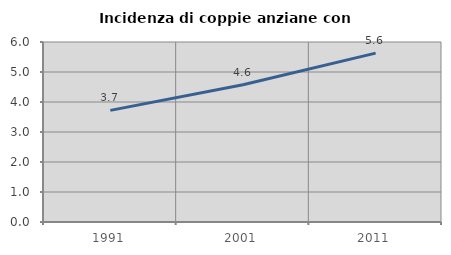
| Category | Incidenza di coppie anziane con figli |
|---|---|
| 1991.0 | 3.721 |
| 2001.0 | 4.573 |
| 2011.0 | 5.63 |